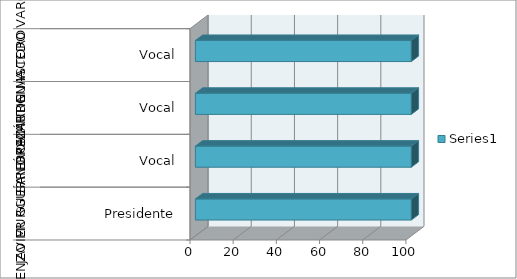
| Category | Series 0 |
|---|---|
| 0 | 100 |
| 1 | 100 |
| 2 | 100 |
| 3 | 100 |